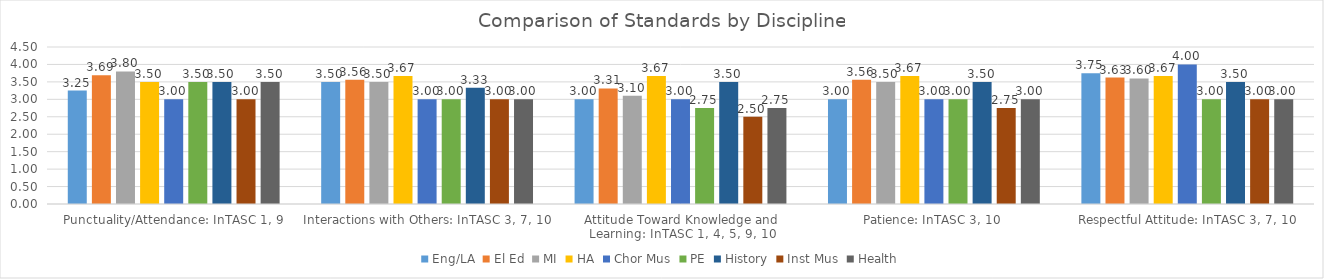
| Category | Eng/LA | El Ed | MI | HA | Chor Mus | PE | History | Inst Mus | Health |
|---|---|---|---|---|---|---|---|---|---|
| Punctuality/Attendance: InTASC 1, 9 | 3.25 | 3.688 | 3.8 | 3.5 | 3 | 3.5 | 3.5 | 3 | 3.5 |
| Interactions with Others: InTASC 3, 7, 10 | 3.5 | 3.562 | 3.5 | 3.667 | 3 | 3 | 3.333 | 3 | 3 |
| Attitude Toward Knowledge and Learning: InTASC 1, 4, 5, 9, 10 | 3 | 3.312 | 3.1 | 3.667 | 3 | 2.75 | 3.5 | 2.5 | 2.75 |
| Patience: InTASC 3, 10 | 3 | 3.562 | 3.5 | 3.667 | 3 | 3 | 3.5 | 2.75 | 3 |
| Respectful Attitude: InTASC 3, 7, 10 | 3.75 | 3.625 | 3.6 | 3.667 | 4 | 3 | 3.5 | 3 | 3 |